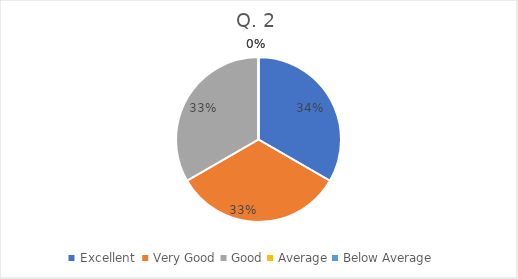
| Category | Series 0 |
|---|---|
| Excellent  | 5 |
| Very Good | 5 |
| Good | 5 |
| Average | 0 |
| Below Average | 0 |